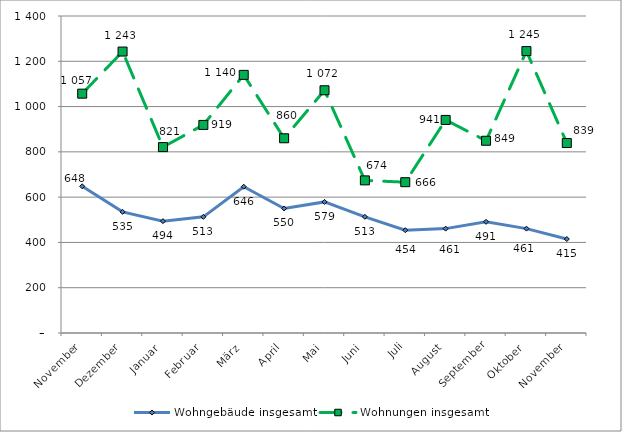
| Category | Wohngebäude insgesamt | Wohnungen insgesamt |
|---|---|---|
| November | 648 | 1057 |
| Dezember | 535 | 1243 |
| Januar | 494 | 821 |
| Februar | 513 | 919 |
| März | 646 | 1140 |
| April | 550 | 860 |
| Mai | 579 | 1072 |
| Juni | 513 | 674 |
| Juli | 454 | 666 |
| August | 461 | 941 |
| September | 491 | 849 |
| Oktober | 461 | 1245 |
| November | 415 | 839 |